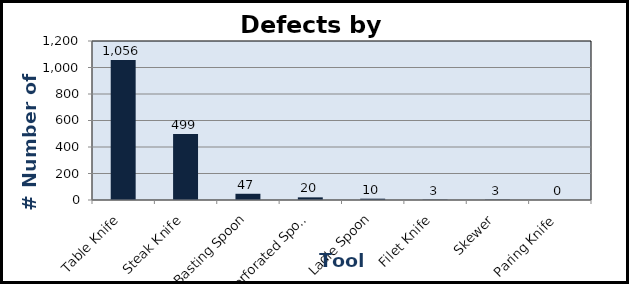
| Category | REJECTED |
|---|---|
| Table Knife | 1056 |
| Steak Knife | 499 |
| Basting Spoon | 47 |
| Perforated Spoon | 20 |
| Ladle Spoon | 10 |
| Filet Knife | 3 |
| Skewer | 3 |
| Paring Knife | 0 |